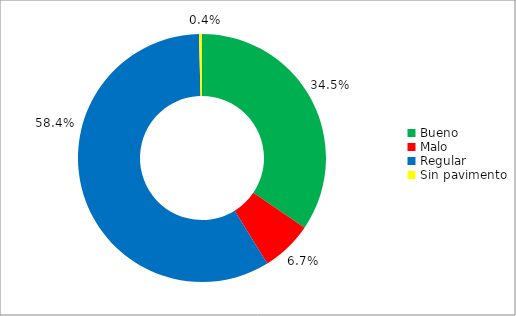
| Category | Series 0 |
|---|---|
| Bueno | 0.345 |
| Malo | 0.067 |
| Regular | 0.584 |
| Sin pavimento | 0.004 |